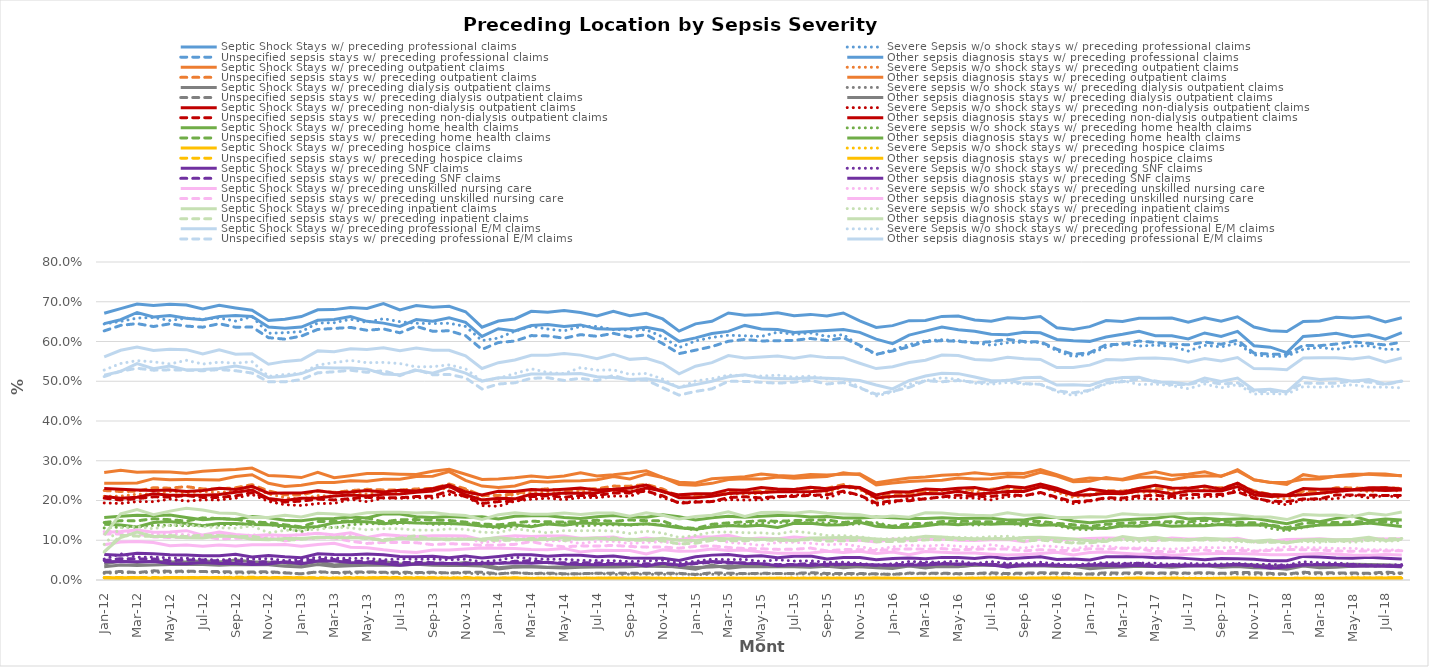
| Category | Septic Shock Stays w/ preceding professional claims | Severe Sepsis w/o shock stays w/ preceding professional claims | Unspecified sepsis stays w/ preceding professional claims | Other sepsis diagnosis stays w/ preceding professional claims | Septic Shock Stays w/ preceding outpatient claims | Severe Sepsis w/o shock stays w/ preceding outpatient claims | Unspecified sepsis stays w/ preceding outpatient claims | Other sepsis diagnosis stays w/ preceding outpatient claims | Septic Shock Stays w/ preceding dialysis outpatient claims | Severe sepsis w/o shock stays w/ preceding dialysis outpatient claims | Unspecified sepsis stays w/ preceding dialysis outpatient claims | Other sepsis diagnosis stays w/ preceding dialysis outpatient claims | Septic Shock Stays w/ preceding non-dialysis outpatient claims | Severe Sepsis w/o shock stays w/ preceding non-dialysis outpatient claims | Unspecified sepsis stays w/ preceding non-dialysis outpatient claims | Other sepsis diagnosis stays w/ preceding non-dialysis outpatient claims | Septic Shock Stays w/ preceding home health claims | Severe sepsis w/o shock stays w/ preceding home health claims | Unspecified sepsis stays w/ preceding home health claims | Other sepsis diagnosis stays w/ preceding home health claims | Septic Shock Stays w/ preceding hospice claims | Severe Sepsis w/o shock stays w/ preceding hospice claims | Unspecified sepsis stays w/ preceding hospice claims | Other sepsis diagnosis stays w/ preceding hospice claims | Septic Shock Stays w/ preceding SNF claims | Severe Sepsis w/o shock stays w/ preceding SNF claims | Unspecified sepsis stays w/ preceding SNF claims | Other sepsis diagnosis stays w/ preceding SNF claims | Septic Shock Stays w/ preceding unskilled nursing care | Severe sepsis w/o shock stays w/ preceding unskilled nursing care | Unspecified sepsis stays w/ preceding unskilled nursing care | Other sepsis diagnosis stays w/ preceding unskilled nursing care | Septic Shock Stays w/ preceding inpatient claims | Severe sepsis w/o shock stays w/ preceding inpatient claims | Unspecified sepsis stays w/ preceding inpatient claims | Other sepsis diagnosis stays w/ preceding inpatient claims | Septic Shock Stays w/ preceding professional E/M claims | Severe Sepsis w/o shock stays w/ preceding professional E/M claims | Unspecified sepsis stays w/ preceding professional E/M claims | Other sepsis diagnosis stays w/ preceding professional E/M claims |
|---|---|---|---|---|---|---|---|---|---|---|---|---|---|---|---|---|---|---|---|---|---|---|---|---|---|---|---|---|---|---|---|---|---|---|---|---|---|---|---|---|
| 2012-01-01 | 0.671 | 0.644 | 0.627 | 0.645 | 0.243 | 0.211 | 0.225 | 0.271 | 0.033 | 0.017 | 0.019 | 0.04 | 0.21 | 0.194 | 0.206 | 0.23 | 0.14 | 0.131 | 0.145 | 0.157 | 0.005 | 0.005 | 0.006 | 0.006 | 0.064 | 0.053 | 0.049 | 0.046 | 0.12 | 0.122 | 0.116 | 0.089 | 0.113 | 0.09 | 0.07 | 0.071 | 0.561 | 0.528 | 0.512 | 0.515 |
| 2012-02-01 | 0.683 | 0.651 | 0.641 | 0.655 | 0.243 | 0.211 | 0.223 | 0.276 | 0.037 | 0.018 | 0.021 | 0.048 | 0.206 | 0.193 | 0.201 | 0.229 | 0.138 | 0.133 | 0.149 | 0.16 | 0.006 | 0.005 | 0.006 | 0.004 | 0.062 | 0.066 | 0.054 | 0.047 | 0.122 | 0.123 | 0.116 | 0.096 | 0.166 | 0.132 | 0.112 | 0.107 | 0.578 | 0.545 | 0.525 | 0.525 |
| 2012-03-01 | 0.694 | 0.659 | 0.645 | 0.673 | 0.244 | 0.216 | 0.223 | 0.271 | 0.036 | 0.018 | 0.019 | 0.044 | 0.208 | 0.197 | 0.205 | 0.227 | 0.133 | 0.133 | 0.149 | 0.163 | 0.005 | 0.006 | 0.006 | 0.006 | 0.067 | 0.057 | 0.053 | 0.046 | 0.126 | 0.12 | 0.116 | 0.097 | 0.177 | 0.135 | 0.11 | 0.121 | 0.586 | 0.552 | 0.533 | 0.544 |
| 2012-04-01 | 0.69 | 0.66 | 0.638 | 0.662 | 0.255 | 0.216 | 0.232 | 0.273 | 0.038 | 0.019 | 0.023 | 0.047 | 0.217 | 0.197 | 0.209 | 0.225 | 0.145 | 0.138 | 0.154 | 0.162 | 0.004 | 0.004 | 0.006 | 0.005 | 0.066 | 0.058 | 0.053 | 0.047 | 0.12 | 0.114 | 0.108 | 0.094 | 0.164 | 0.129 | 0.11 | 0.11 | 0.577 | 0.549 | 0.528 | 0.531 |
| 2012-05-01 | 0.694 | 0.653 | 0.644 | 0.665 | 0.252 | 0.223 | 0.231 | 0.272 | 0.039 | 0.019 | 0.022 | 0.045 | 0.213 | 0.204 | 0.209 | 0.226 | 0.147 | 0.137 | 0.152 | 0.164 | 0.006 | 0.006 | 0.005 | 0.005 | 0.064 | 0.056 | 0.049 | 0.042 | 0.121 | 0.116 | 0.107 | 0.086 | 0.173 | 0.138 | 0.112 | 0.109 | 0.58 | 0.544 | 0.529 | 0.539 |
| 2012-06-01 | 0.692 | 0.659 | 0.639 | 0.658 | 0.253 | 0.219 | 0.235 | 0.269 | 0.04 | 0.021 | 0.022 | 0.046 | 0.213 | 0.198 | 0.213 | 0.223 | 0.142 | 0.136 | 0.148 | 0.157 | 0.006 | 0.005 | 0.006 | 0.005 | 0.063 | 0.055 | 0.05 | 0.041 | 0.124 | 0.114 | 0.107 | 0.088 | 0.181 | 0.139 | 0.109 | 0.106 | 0.58 | 0.553 | 0.528 | 0.529 |
| 2012-07-01 | 0.682 | 0.656 | 0.636 | 0.655 | 0.253 | 0.223 | 0.229 | 0.274 | 0.039 | 0.021 | 0.021 | 0.048 | 0.213 | 0.202 | 0.208 | 0.225 | 0.136 | 0.138 | 0.156 | 0.152 | 0.005 | 0.006 | 0.006 | 0.006 | 0.061 | 0.052 | 0.05 | 0.044 | 0.113 | 0.112 | 0.11 | 0.085 | 0.176 | 0.134 | 0.113 | 0.106 | 0.569 | 0.543 | 0.526 | 0.53 |
| 2012-08-01 | 0.691 | 0.659 | 0.645 | 0.663 | 0.252 | 0.22 | 0.229 | 0.276 | 0.037 | 0.019 | 0.021 | 0.046 | 0.215 | 0.201 | 0.208 | 0.231 | 0.142 | 0.138 | 0.154 | 0.155 | 0.006 | 0.007 | 0.006 | 0.005 | 0.061 | 0.05 | 0.048 | 0.041 | 0.12 | 0.114 | 0.103 | 0.088 | 0.169 | 0.131 | 0.112 | 0.111 | 0.579 | 0.548 | 0.529 | 0.532 |
| 2012-09-01 | 0.684 | 0.651 | 0.636 | 0.665 | 0.26 | 0.223 | 0.232 | 0.278 | 0.039 | 0.017 | 0.02 | 0.05 | 0.221 | 0.206 | 0.212 | 0.228 | 0.142 | 0.14 | 0.153 | 0.152 | 0.004 | 0.007 | 0.007 | 0.005 | 0.065 | 0.053 | 0.048 | 0.041 | 0.115 | 0.108 | 0.105 | 0.085 | 0.167 | 0.13 | 0.109 | 0.11 | 0.568 | 0.545 | 0.527 | 0.539 |
| 2012-10-01 | 0.678 | 0.663 | 0.636 | 0.663 | 0.265 | 0.233 | 0.24 | 0.282 | 0.038 | 0.018 | 0.02 | 0.046 | 0.226 | 0.215 | 0.22 | 0.236 | 0.14 | 0.142 | 0.146 | 0.16 | 0.005 | 0.005 | 0.007 | 0.004 | 0.058 | 0.053 | 0.045 | 0.039 | 0.111 | 0.114 | 0.104 | 0.089 | 0.157 | 0.136 | 0.11 | 0.102 | 0.569 | 0.549 | 0.521 | 0.531 |
| 2012-11-01 | 0.653 | 0.621 | 0.61 | 0.636 | 0.243 | 0.216 | 0.224 | 0.263 | 0.038 | 0.019 | 0.021 | 0.044 | 0.205 | 0.198 | 0.203 | 0.218 | 0.139 | 0.141 | 0.144 | 0.157 | 0.005 | 0.005 | 0.006 | 0.005 | 0.062 | 0.054 | 0.046 | 0.04 | 0.114 | 0.108 | 0.106 | 0.088 | 0.157 | 0.119 | 0.103 | 0.102 | 0.543 | 0.512 | 0.499 | 0.51 |
| 2012-12-01 | 0.656 | 0.622 | 0.606 | 0.633 | 0.235 | 0.207 | 0.214 | 0.261 | 0.035 | 0.018 | 0.018 | 0.042 | 0.2 | 0.189 | 0.196 | 0.219 | 0.136 | 0.13 | 0.139 | 0.15 | 0.005 | 0.006 | 0.006 | 0.006 | 0.058 | 0.049 | 0.044 | 0.046 | 0.112 | 0.107 | 0.099 | 0.089 | 0.163 | 0.125 | 0.1 | 0.104 | 0.55 | 0.517 | 0.499 | 0.513 |
| 2013-01-01 | 0.663 | 0.625 | 0.614 | 0.636 | 0.239 | 0.203 | 0.214 | 0.258 | 0.033 | 0.016 | 0.015 | 0.039 | 0.206 | 0.187 | 0.198 | 0.219 | 0.132 | 0.121 | 0.134 | 0.149 | 0.006 | 0.005 | 0.005 | 0.004 | 0.056 | 0.052 | 0.047 | 0.041 | 0.114 | 0.116 | 0.104 | 0.085 | 0.158 | 0.126 | 0.102 | 0.105 | 0.553 | 0.52 | 0.504 | 0.519 |
| 2013-02-01 | 0.68 | 0.646 | 0.63 | 0.653 | 0.245 | 0.212 | 0.224 | 0.271 | 0.039 | 0.02 | 0.021 | 0.047 | 0.206 | 0.192 | 0.203 | 0.224 | 0.135 | 0.136 | 0.147 | 0.154 | 0.005 | 0.005 | 0.006 | 0.004 | 0.066 | 0.057 | 0.052 | 0.048 | 0.118 | 0.117 | 0.106 | 0.089 | 0.168 | 0.127 | 0.106 | 0.107 | 0.576 | 0.541 | 0.521 | 0.535 |
| 2013-03-01 | 0.68 | 0.647 | 0.633 | 0.655 | 0.245 | 0.211 | 0.22 | 0.257 | 0.034 | 0.018 | 0.019 | 0.038 | 0.211 | 0.193 | 0.201 | 0.219 | 0.144 | 0.131 | 0.147 | 0.155 | 0.004 | 0.005 | 0.005 | 0.004 | 0.064 | 0.055 | 0.051 | 0.048 | 0.113 | 0.113 | 0.106 | 0.092 | 0.166 | 0.133 | 0.108 | 0.106 | 0.574 | 0.547 | 0.524 | 0.533 |
| 2013-04-01 | 0.685 | 0.656 | 0.635 | 0.663 | 0.249 | 0.219 | 0.225 | 0.262 | 0.036 | 0.016 | 0.02 | 0.041 | 0.214 | 0.203 | 0.205 | 0.221 | 0.147 | 0.139 | 0.149 | 0.158 | 0.005 | 0.005 | 0.006 | 0.004 | 0.064 | 0.054 | 0.048 | 0.044 | 0.119 | 0.112 | 0.098 | 0.083 | 0.163 | 0.131 | 0.108 | 0.107 | 0.582 | 0.552 | 0.528 | 0.534 |
| 2013-05-01 | 0.683 | 0.648 | 0.628 | 0.651 | 0.248 | 0.216 | 0.228 | 0.268 | 0.037 | 0.02 | 0.02 | 0.043 | 0.212 | 0.197 | 0.208 | 0.225 | 0.146 | 0.142 | 0.156 | 0.156 | 0.005 | 0.005 | 0.005 | 0.004 | 0.065 | 0.055 | 0.046 | 0.043 | 0.107 | 0.106 | 0.092 | 0.081 | 0.169 | 0.126 | 0.104 | 0.106 | 0.58 | 0.547 | 0.522 | 0.531 |
| 2013-06-01 | 0.696 | 0.657 | 0.632 | 0.646 | 0.253 | 0.224 | 0.226 | 0.268 | 0.038 | 0.018 | 0.02 | 0.046 | 0.216 | 0.206 | 0.207 | 0.221 | 0.142 | 0.141 | 0.146 | 0.167 | 0.005 | 0.005 | 0.006 | 0.005 | 0.063 | 0.051 | 0.047 | 0.041 | 0.114 | 0.101 | 0.095 | 0.076 | 0.171 | 0.129 | 0.101 | 0.099 | 0.584 | 0.547 | 0.526 | 0.519 |
| 2013-07-01 | 0.679 | 0.65 | 0.622 | 0.638 | 0.253 | 0.221 | 0.226 | 0.266 | 0.037 | 0.016 | 0.019 | 0.04 | 0.217 | 0.205 | 0.207 | 0.226 | 0.145 | 0.142 | 0.152 | 0.166 | 0.004 | 0.006 | 0.006 | 0.004 | 0.059 | 0.053 | 0.044 | 0.037 | 0.111 | 0.105 | 0.095 | 0.072 | 0.17 | 0.129 | 0.105 | 0.105 | 0.577 | 0.545 | 0.514 | 0.516 |
| 2013-08-01 | 0.69 | 0.646 | 0.638 | 0.655 | 0.26 | 0.225 | 0.229 | 0.265 | 0.039 | 0.017 | 0.019 | 0.041 | 0.221 | 0.207 | 0.21 | 0.224 | 0.144 | 0.146 | 0.152 | 0.159 | 0.004 | 0.006 | 0.006 | 0.005 | 0.059 | 0.052 | 0.044 | 0.04 | 0.11 | 0.104 | 0.094 | 0.069 | 0.169 | 0.126 | 0.112 | 0.103 | 0.583 | 0.536 | 0.53 | 0.527 |
| 2013-09-01 | 0.686 | 0.645 | 0.626 | 0.651 | 0.261 | 0.223 | 0.23 | 0.273 | 0.037 | 0.017 | 0.019 | 0.043 | 0.224 | 0.206 | 0.211 | 0.231 | 0.143 | 0.14 | 0.151 | 0.157 | 0.005 | 0.005 | 0.006 | 0.004 | 0.06 | 0.053 | 0.044 | 0.041 | 0.111 | 0.102 | 0.089 | 0.076 | 0.17 | 0.125 | 0.103 | 0.103 | 0.578 | 0.537 | 0.516 | 0.52 |
| 2013-10-01 | 0.688 | 0.646 | 0.627 | 0.659 | 0.273 | 0.233 | 0.241 | 0.279 | 0.037 | 0.018 | 0.018 | 0.04 | 0.236 | 0.215 | 0.224 | 0.239 | 0.142 | 0.141 | 0.15 | 0.159 | 0.004 | 0.006 | 0.005 | 0.004 | 0.056 | 0.051 | 0.042 | 0.042 | 0.111 | 0.104 | 0.091 | 0.076 | 0.164 | 0.129 | 0.101 | 0.103 | 0.578 | 0.541 | 0.517 | 0.533 |
| 2013-11-01 | 0.675 | 0.638 | 0.615 | 0.648 | 0.251 | 0.228 | 0.229 | 0.266 | 0.036 | 0.017 | 0.02 | 0.044 | 0.214 | 0.211 | 0.21 | 0.222 | 0.14 | 0.143 | 0.146 | 0.158 | 0.004 | 0.005 | 0.006 | 0.003 | 0.06 | 0.052 | 0.042 | 0.04 | 0.111 | 0.106 | 0.09 | 0.078 | 0.162 | 0.128 | 0.104 | 0.102 | 0.564 | 0.531 | 0.509 | 0.521 |
| 2013-12-01 | 0.636 | 0.602 | 0.58 | 0.613 | 0.236 | 0.202 | 0.212 | 0.253 | 0.035 | 0.015 | 0.02 | 0.039 | 0.201 | 0.187 | 0.192 | 0.214 | 0.136 | 0.135 | 0.141 | 0.159 | 0.005 | 0.004 | 0.005 | 0.003 | 0.055 | 0.045 | 0.04 | 0.042 | 0.101 | 0.094 | 0.087 | 0.08 | 0.153 | 0.12 | 0.1 | 0.103 | 0.532 | 0.501 | 0.48 | 0.5 |
| 2014-01-01 | 0.651 | 0.609 | 0.597 | 0.632 | 0.233 | 0.201 | 0.213 | 0.254 | 0.027 | 0.015 | 0.016 | 0.031 | 0.206 | 0.185 | 0.197 | 0.223 | 0.133 | 0.131 | 0.139 | 0.154 | 0.004 | 0.004 | 0.005 | 0.003 | 0.059 | 0.05 | 0.042 | 0.042 | 0.107 | 0.097 | 0.088 | 0.08 | 0.164 | 0.119 | 0.1 | 0.106 | 0.547 | 0.507 | 0.493 | 0.509 |
| 2014-02-01 | 0.657 | 0.626 | 0.601 | 0.626 | 0.237 | 0.216 | 0.217 | 0.257 | 0.032 | 0.018 | 0.019 | 0.035 | 0.204 | 0.198 | 0.198 | 0.223 | 0.139 | 0.134 | 0.143 | 0.16 | 0.005 | 0.005 | 0.005 | 0.005 | 0.063 | 0.058 | 0.047 | 0.044 | 0.111 | 0.104 | 0.09 | 0.079 | 0.169 | 0.129 | 0.1 | 0.102 | 0.554 | 0.519 | 0.496 | 0.509 |
| 2014-03-01 | 0.676 | 0.638 | 0.615 | 0.64 | 0.248 | 0.219 | 0.226 | 0.262 | 0.033 | 0.016 | 0.016 | 0.034 | 0.215 | 0.203 | 0.21 | 0.228 | 0.134 | 0.137 | 0.148 | 0.162 | 0.004 | 0.005 | 0.004 | 0.003 | 0.064 | 0.053 | 0.049 | 0.042 | 0.109 | 0.108 | 0.097 | 0.077 | 0.165 | 0.124 | 0.104 | 0.101 | 0.565 | 0.531 | 0.507 | 0.518 |
| 2014-04-01 | 0.673 | 0.631 | 0.614 | 0.643 | 0.247 | 0.221 | 0.229 | 0.258 | 0.032 | 0.016 | 0.017 | 0.032 | 0.215 | 0.206 | 0.212 | 0.226 | 0.141 | 0.14 | 0.146 | 0.162 | 0.004 | 0.004 | 0.004 | 0.003 | 0.06 | 0.052 | 0.044 | 0.045 | 0.111 | 0.098 | 0.088 | 0.076 | 0.166 | 0.119 | 0.105 | 0.102 | 0.565 | 0.522 | 0.509 | 0.518 |
| 2014-05-01 | 0.678 | 0.627 | 0.608 | 0.638 | 0.249 | 0.217 | 0.224 | 0.262 | 0.03 | 0.015 | 0.016 | 0.033 | 0.219 | 0.202 | 0.208 | 0.229 | 0.138 | 0.144 | 0.146 | 0.157 | 0.004 | 0.004 | 0.004 | 0.003 | 0.062 | 0.052 | 0.043 | 0.04 | 0.111 | 0.099 | 0.083 | 0.08 | 0.169 | 0.124 | 0.099 | 0.106 | 0.57 | 0.519 | 0.502 | 0.518 |
| 2014-06-01 | 0.673 | 0.638 | 0.617 | 0.642 | 0.25 | 0.223 | 0.228 | 0.27 | 0.032 | 0.016 | 0.016 | 0.039 | 0.218 | 0.207 | 0.213 | 0.231 | 0.144 | 0.136 | 0.147 | 0.155 | 0.004 | 0.004 | 0.005 | 0.004 | 0.062 | 0.049 | 0.043 | 0.039 | 0.105 | 0.092 | 0.086 | 0.071 | 0.165 | 0.124 | 0.104 | 0.103 | 0.566 | 0.534 | 0.507 | 0.52 |
| 2014-07-01 | 0.664 | 0.638 | 0.613 | 0.632 | 0.252 | 0.224 | 0.23 | 0.262 | 0.032 | 0.017 | 0.017 | 0.035 | 0.22 | 0.207 | 0.213 | 0.227 | 0.142 | 0.138 | 0.15 | 0.159 | 0.005 | 0.004 | 0.004 | 0.004 | 0.058 | 0.049 | 0.043 | 0.039 | 0.106 | 0.097 | 0.085 | 0.075 | 0.168 | 0.125 | 0.104 | 0.106 | 0.557 | 0.528 | 0.502 | 0.511 |
| 2014-08-01 | 0.676 | 0.63 | 0.621 | 0.631 | 0.26 | 0.225 | 0.236 | 0.265 | 0.033 | 0.014 | 0.017 | 0.037 | 0.227 | 0.211 | 0.219 | 0.228 | 0.142 | 0.139 | 0.148 | 0.163 | 0.005 | 0.004 | 0.004 | 0.003 | 0.06 | 0.048 | 0.042 | 0.04 | 0.108 | 0.097 | 0.087 | 0.074 | 0.169 | 0.123 | 0.106 | 0.102 | 0.568 | 0.529 | 0.515 | 0.51 |
| 2014-09-01 | 0.665 | 0.629 | 0.611 | 0.632 | 0.254 | 0.225 | 0.236 | 0.269 | 0.033 | 0.015 | 0.017 | 0.038 | 0.221 | 0.211 | 0.219 | 0.232 | 0.139 | 0.138 | 0.151 | 0.159 | 0.005 | 0.005 | 0.005 | 0.003 | 0.056 | 0.046 | 0.04 | 0.04 | 0.1 | 0.092 | 0.084 | 0.074 | 0.16 | 0.117 | 0.1 | 0.102 | 0.555 | 0.517 | 0.503 | 0.504 |
| 2014-10-01 | 0.671 | 0.63 | 0.617 | 0.636 | 0.267 | 0.24 | 0.241 | 0.275 | 0.035 | 0.015 | 0.017 | 0.036 | 0.231 | 0.226 | 0.224 | 0.239 | 0.142 | 0.141 | 0.149 | 0.158 | 0.005 | 0.004 | 0.004 | 0.003 | 0.055 | 0.048 | 0.041 | 0.036 | 0.106 | 0.095 | 0.083 | 0.065 | 0.169 | 0.123 | 0.1 | 0.101 | 0.558 | 0.52 | 0.503 | 0.506 |
| 2014-11-01 | 0.657 | 0.611 | 0.595 | 0.628 | 0.258 | 0.221 | 0.229 | 0.258 | 0.034 | 0.014 | 0.017 | 0.036 | 0.224 | 0.207 | 0.212 | 0.222 | 0.137 | 0.139 | 0.149 | 0.164 | 0.004 | 0.005 | 0.005 | 0.004 | 0.055 | 0.05 | 0.041 | 0.042 | 0.101 | 0.096 | 0.083 | 0.076 | 0.163 | 0.118 | 0.099 | 0.105 | 0.545 | 0.506 | 0.484 | 0.5 |
| 2014-12-01 | 0.626 | 0.585 | 0.57 | 0.6 | 0.24 | 0.21 | 0.21 | 0.246 | 0.033 | 0.015 | 0.017 | 0.032 | 0.207 | 0.195 | 0.193 | 0.214 | 0.132 | 0.133 | 0.133 | 0.159 | 0.004 | 0.005 | 0.004 | 0.003 | 0.049 | 0.043 | 0.036 | 0.038 | 0.101 | 0.091 | 0.08 | 0.072 | 0.153 | 0.107 | 0.091 | 0.1 | 0.519 | 0.483 | 0.465 | 0.484 |
| 2015-01-01 | 0.644 | 0.602 | 0.578 | 0.609 | 0.238 | 0.211 | 0.21 | 0.244 | 0.031 | 0.013 | 0.014 | 0.027 | 0.207 | 0.197 | 0.196 | 0.217 | 0.128 | 0.126 | 0.129 | 0.151 | 0.003 | 0.005 | 0.004 | 0.003 | 0.058 | 0.047 | 0.041 | 0.043 | 0.109 | 0.099 | 0.085 | 0.073 | 0.16 | 0.112 | 0.092 | 0.099 | 0.538 | 0.501 | 0.474 | 0.492 |
| 2015-02-01 | 0.651 | 0.61 | 0.587 | 0.62 | 0.243 | 0.212 | 0.215 | 0.255 | 0.032 | 0.015 | 0.018 | 0.038 | 0.211 | 0.198 | 0.197 | 0.217 | 0.133 | 0.135 | 0.14 | 0.156 | 0.004 | 0.003 | 0.004 | 0.003 | 0.063 | 0.052 | 0.045 | 0.046 | 0.108 | 0.104 | 0.086 | 0.078 | 0.163 | 0.12 | 0.1 | 0.105 | 0.547 | 0.506 | 0.481 | 0.5 |
| 2015-03-01 | 0.672 | 0.616 | 0.601 | 0.626 | 0.253 | 0.216 | 0.224 | 0.257 | 0.035 | 0.013 | 0.017 | 0.03 | 0.218 | 0.202 | 0.207 | 0.227 | 0.137 | 0.136 | 0.144 | 0.16 | 0.004 | 0.004 | 0.004 | 0.003 | 0.064 | 0.051 | 0.043 | 0.045 | 0.112 | 0.095 | 0.082 | 0.074 | 0.172 | 0.121 | 0.099 | 0.104 | 0.565 | 0.515 | 0.5 | 0.511 |
| 2015-04-01 | 0.666 | 0.614 | 0.605 | 0.64 | 0.255 | 0.217 | 0.226 | 0.26 | 0.035 | 0.016 | 0.016 | 0.034 | 0.219 | 0.201 | 0.21 | 0.226 | 0.135 | 0.14 | 0.146 | 0.158 | 0.004 | 0.004 | 0.004 | 0.003 | 0.059 | 0.052 | 0.044 | 0.042 | 0.103 | 0.091 | 0.079 | 0.076 | 0.16 | 0.119 | 0.099 | 0.104 | 0.559 | 0.515 | 0.5 | 0.516 |
| 2015-05-01 | 0.668 | 0.613 | 0.601 | 0.631 | 0.254 | 0.217 | 0.223 | 0.266 | 0.034 | 0.015 | 0.017 | 0.034 | 0.22 | 0.202 | 0.206 | 0.233 | 0.138 | 0.143 | 0.149 | 0.16 | 0.005 | 0.004 | 0.004 | 0.004 | 0.061 | 0.046 | 0.041 | 0.041 | 0.106 | 0.087 | 0.079 | 0.071 | 0.17 | 0.118 | 0.102 | 0.102 | 0.561 | 0.513 | 0.497 | 0.509 |
| 2015-06-01 | 0.672 | 0.623 | 0.602 | 0.63 | 0.259 | 0.225 | 0.227 | 0.263 | 0.037 | 0.016 | 0.016 | 0.034 | 0.222 | 0.208 | 0.21 | 0.229 | 0.132 | 0.145 | 0.148 | 0.162 | 0.004 | 0.004 | 0.004 | 0.003 | 0.056 | 0.051 | 0.039 | 0.036 | 0.104 | 0.095 | 0.077 | 0.067 | 0.17 | 0.116 | 0.099 | 0.104 | 0.563 | 0.515 | 0.495 | 0.507 |
| 2015-07-01 | 0.665 | 0.618 | 0.603 | 0.623 | 0.256 | 0.229 | 0.227 | 0.261 | 0.034 | 0.015 | 0.016 | 0.033 | 0.222 | 0.214 | 0.21 | 0.228 | 0.142 | 0.143 | 0.149 | 0.162 | 0.004 | 0.006 | 0.004 | 0.004 | 0.06 | 0.048 | 0.039 | 0.039 | 0.108 | 0.095 | 0.077 | 0.067 | 0.168 | 0.123 | 0.1 | 0.098 | 0.558 | 0.51 | 0.498 | 0.506 |
| 2015-08-01 | 0.668 | 0.622 | 0.608 | 0.625 | 0.258 | 0.231 | 0.232 | 0.266 | 0.036 | 0.015 | 0.019 | 0.032 | 0.222 | 0.216 | 0.213 | 0.233 | 0.143 | 0.145 | 0.151 | 0.159 | 0.005 | 0.005 | 0.004 | 0.003 | 0.06 | 0.048 | 0.042 | 0.036 | 0.105 | 0.092 | 0.08 | 0.068 | 0.173 | 0.118 | 0.102 | 0.106 | 0.564 | 0.513 | 0.502 | 0.509 |
| 2015-09-01 | 0.664 | 0.613 | 0.603 | 0.628 | 0.26 | 0.22 | 0.231 | 0.264 | 0.035 | 0.014 | 0.016 | 0.034 | 0.225 | 0.206 | 0.214 | 0.23 | 0.138 | 0.144 | 0.151 | 0.16 | 0.004 | 0.005 | 0.004 | 0.003 | 0.053 | 0.044 | 0.037 | 0.039 | 0.103 | 0.089 | 0.073 | 0.072 | 0.168 | 0.112 | 0.098 | 0.107 | 0.559 | 0.506 | 0.493 | 0.508 |
| 2015-10-01 | 0.672 | 0.617 | 0.609 | 0.63 | 0.27 | 0.235 | 0.24 | 0.266 | 0.035 | 0.014 | 0.017 | 0.031 | 0.235 | 0.221 | 0.223 | 0.235 | 0.139 | 0.139 | 0.144 | 0.156 | 0.004 | 0.005 | 0.004 | 0.003 | 0.057 | 0.045 | 0.039 | 0.039 | 0.1 | 0.091 | 0.077 | 0.069 | 0.166 | 0.111 | 0.099 | 0.107 | 0.559 | 0.506 | 0.497 | 0.506 |
| 2015-11-01 | 0.652 | 0.588 | 0.591 | 0.623 | 0.265 | 0.228 | 0.23 | 0.267 | 0.033 | 0.014 | 0.016 | 0.034 | 0.231 | 0.213 | 0.213 | 0.233 | 0.145 | 0.141 | 0.149 | 0.156 | 0.004 | 0.004 | 0.004 | 0.003 | 0.056 | 0.042 | 0.039 | 0.039 | 0.1 | 0.084 | 0.076 | 0.072 | 0.164 | 0.109 | 0.1 | 0.106 | 0.545 | 0.485 | 0.483 | 0.502 |
| 2015-12-01 | 0.635 | 0.567 | 0.568 | 0.606 | 0.239 | 0.203 | 0.209 | 0.244 | 0.033 | 0.015 | 0.015 | 0.031 | 0.206 | 0.188 | 0.194 | 0.214 | 0.135 | 0.145 | 0.14 | 0.158 | 0.005 | 0.004 | 0.004 | 0.003 | 0.051 | 0.038 | 0.037 | 0.038 | 0.096 | 0.077 | 0.074 | 0.067 | 0.157 | 0.103 | 0.096 | 0.103 | 0.532 | 0.463 | 0.467 | 0.491 |
| 2016-01-01 | 0.64 | 0.579 | 0.576 | 0.595 | 0.244 | 0.209 | 0.214 | 0.251 | 0.034 | 0.014 | 0.014 | 0.029 | 0.21 | 0.195 | 0.2 | 0.222 | 0.132 | 0.135 | 0.135 | 0.157 | 0.004 | 0.005 | 0.005 | 0.002 | 0.054 | 0.041 | 0.038 | 0.037 | 0.103 | 0.083 | 0.077 | 0.07 | 0.161 | 0.104 | 0.097 | 0.101 | 0.537 | 0.473 | 0.475 | 0.481 |
| 2016-02-01 | 0.652 | 0.592 | 0.587 | 0.616 | 0.248 | 0.222 | 0.216 | 0.257 | 0.037 | 0.016 | 0.017 | 0.035 | 0.211 | 0.206 | 0.199 | 0.222 | 0.133 | 0.137 | 0.142 | 0.155 | 0.004 | 0.003 | 0.004 | 0.003 | 0.055 | 0.046 | 0.04 | 0.038 | 0.1 | 0.088 | 0.078 | 0.064 | 0.158 | 0.107 | 0.098 | 0.105 | 0.547 | 0.493 | 0.485 | 0.502 |
| 2016-03-01 | 0.653 | 0.602 | 0.6 | 0.626 | 0.249 | 0.219 | 0.222 | 0.259 | 0.032 | 0.016 | 0.017 | 0.03 | 0.217 | 0.204 | 0.205 | 0.229 | 0.136 | 0.139 | 0.142 | 0.155 | 0.004 | 0.004 | 0.003 | 0.003 | 0.054 | 0.045 | 0.042 | 0.038 | 0.102 | 0.085 | 0.077 | 0.072 | 0.169 | 0.108 | 0.101 | 0.11 | 0.553 | 0.501 | 0.502 | 0.513 |
| 2016-04-01 | 0.663 | 0.605 | 0.602 | 0.637 | 0.251 | 0.225 | 0.226 | 0.264 | 0.034 | 0.016 | 0.017 | 0.037 | 0.217 | 0.209 | 0.209 | 0.227 | 0.141 | 0.141 | 0.147 | 0.157 | 0.005 | 0.004 | 0.004 | 0.003 | 0.057 | 0.045 | 0.042 | 0.04 | 0.103 | 0.088 | 0.079 | 0.07 | 0.169 | 0.108 | 0.101 | 0.108 | 0.566 | 0.509 | 0.499 | 0.52 |
| 2016-05-01 | 0.664 | 0.602 | 0.6 | 0.63 | 0.257 | 0.222 | 0.23 | 0.265 | 0.033 | 0.015 | 0.016 | 0.034 | 0.223 | 0.207 | 0.214 | 0.231 | 0.139 | 0.144 | 0.148 | 0.155 | 0.004 | 0.004 | 0.004 | 0.003 | 0.056 | 0.048 | 0.039 | 0.04 | 0.1 | 0.085 | 0.076 | 0.068 | 0.165 | 0.108 | 0.102 | 0.105 | 0.565 | 0.505 | 0.502 | 0.519 |
| 2016-06-01 | 0.654 | 0.597 | 0.597 | 0.626 | 0.254 | 0.222 | 0.227 | 0.27 | 0.038 | 0.016 | 0.017 | 0.037 | 0.216 | 0.206 | 0.21 | 0.233 | 0.142 | 0.138 | 0.147 | 0.155 | 0.005 | 0.005 | 0.004 | 0.003 | 0.054 | 0.041 | 0.039 | 0.04 | 0.1 | 0.082 | 0.078 | 0.068 | 0.163 | 0.106 | 0.101 | 0.104 | 0.555 | 0.495 | 0.497 | 0.511 |
| 2016-07-01 | 0.651 | 0.59 | 0.599 | 0.619 | 0.255 | 0.217 | 0.228 | 0.265 | 0.036 | 0.015 | 0.018 | 0.04 | 0.219 | 0.202 | 0.21 | 0.225 | 0.14 | 0.142 | 0.146 | 0.155 | 0.005 | 0.005 | 0.004 | 0.003 | 0.059 | 0.046 | 0.039 | 0.038 | 0.101 | 0.089 | 0.078 | 0.065 | 0.161 | 0.109 | 0.104 | 0.104 | 0.553 | 0.493 | 0.498 | 0.501 |
| 2016-08-01 | 0.659 | 0.597 | 0.605 | 0.617 | 0.26 | 0.224 | 0.231 | 0.269 | 0.037 | 0.014 | 0.016 | 0.033 | 0.223 | 0.21 | 0.215 | 0.236 | 0.142 | 0.145 | 0.147 | 0.151 | 0.005 | 0.004 | 0.005 | 0.002 | 0.053 | 0.042 | 0.038 | 0.033 | 0.102 | 0.083 | 0.078 | 0.063 | 0.169 | 0.11 | 0.105 | 0.103 | 0.56 | 0.497 | 0.503 | 0.502 |
| 2016-09-01 | 0.658 | 0.598 | 0.6 | 0.623 | 0.258 | 0.227 | 0.229 | 0.268 | 0.036 | 0.015 | 0.017 | 0.036 | 0.223 | 0.212 | 0.212 | 0.232 | 0.142 | 0.136 | 0.147 | 0.151 | 0.004 | 0.004 | 0.004 | 0.002 | 0.056 | 0.041 | 0.038 | 0.038 | 0.096 | 0.08 | 0.073 | 0.064 | 0.163 | 0.105 | 0.098 | 0.107 | 0.557 | 0.493 | 0.494 | 0.509 |
| 2016-10-01 | 0.663 | 0.597 | 0.599 | 0.622 | 0.271 | 0.236 | 0.238 | 0.278 | 0.036 | 0.016 | 0.018 | 0.037 | 0.235 | 0.22 | 0.22 | 0.241 | 0.138 | 0.143 | 0.147 | 0.158 | 0.005 | 0.004 | 0.004 | 0.003 | 0.058 | 0.044 | 0.039 | 0.037 | 0.104 | 0.086 | 0.076 | 0.067 | 0.164 | 0.107 | 0.101 | 0.107 | 0.555 | 0.493 | 0.492 | 0.51 |
| 2016-11-01 | 0.635 | 0.577 | 0.581 | 0.605 | 0.261 | 0.221 | 0.226 | 0.265 | 0.036 | 0.015 | 0.018 | 0.034 | 0.225 | 0.205 | 0.208 | 0.231 | 0.139 | 0.137 | 0.143 | 0.157 | 0.005 | 0.006 | 0.005 | 0.002 | 0.052 | 0.041 | 0.037 | 0.037 | 0.1 | 0.084 | 0.075 | 0.07 | 0.157 | 0.1 | 0.097 | 0.105 | 0.535 | 0.474 | 0.476 | 0.491 |
| 2016-12-01 | 0.63 | 0.562 | 0.568 | 0.602 | 0.247 | 0.208 | 0.213 | 0.251 | 0.034 | 0.016 | 0.016 | 0.035 | 0.214 | 0.192 | 0.197 | 0.216 | 0.131 | 0.128 | 0.139 | 0.148 | 0.004 | 0.005 | 0.004 | 0.003 | 0.053 | 0.037 | 0.036 | 0.035 | 0.102 | 0.078 | 0.074 | 0.063 | 0.157 | 0.094 | 0.093 | 0.103 | 0.535 | 0.464 | 0.471 | 0.491 |
| 2017-01-01 | 0.637 | 0.569 | 0.572 | 0.6 | 0.249 | 0.213 | 0.215 | 0.257 | 0.035 | 0.014 | 0.015 | 0.028 | 0.214 | 0.198 | 0.2 | 0.229 | 0.131 | 0.126 | 0.135 | 0.144 | 0.004 | 0.004 | 0.004 | 0.003 | 0.05 | 0.041 | 0.038 | 0.038 | 0.104 | 0.086 | 0.079 | 0.069 | 0.159 | 0.099 | 0.094 | 0.099 | 0.541 | 0.477 | 0.477 | 0.489 |
| 2017-02-01 | 0.653 | 0.586 | 0.592 | 0.611 | 0.258 | 0.219 | 0.225 | 0.255 | 0.04 | 0.014 | 0.018 | 0.032 | 0.218 | 0.206 | 0.207 | 0.223 | 0.13 | 0.134 | 0.14 | 0.148 | 0.004 | 0.004 | 0.003 | 0.003 | 0.059 | 0.044 | 0.04 | 0.037 | 0.106 | 0.085 | 0.077 | 0.07 | 0.158 | 0.103 | 0.098 | 0.097 | 0.555 | 0.493 | 0.496 | 0.503 |
| 2017-03-01 | 0.65 | 0.595 | 0.593 | 0.618 | 0.252 | 0.217 | 0.223 | 0.254 | 0.035 | 0.015 | 0.017 | 0.033 | 0.217 | 0.201 | 0.206 | 0.221 | 0.136 | 0.135 | 0.143 | 0.151 | 0.004 | 0.003 | 0.004 | 0.004 | 0.059 | 0.042 | 0.04 | 0.035 | 0.105 | 0.08 | 0.08 | 0.067 | 0.167 | 0.1 | 0.103 | 0.109 | 0.553 | 0.502 | 0.499 | 0.509 |
| 2017-04-01 | 0.659 | 0.588 | 0.601 | 0.626 | 0.258 | 0.222 | 0.23 | 0.265 | 0.034 | 0.016 | 0.018 | 0.034 | 0.224 | 0.206 | 0.212 | 0.23 | 0.135 | 0.138 | 0.145 | 0.154 | 0.005 | 0.004 | 0.004 | 0.002 | 0.059 | 0.043 | 0.042 | 0.037 | 0.104 | 0.081 | 0.078 | 0.065 | 0.164 | 0.097 | 0.101 | 0.104 | 0.558 | 0.492 | 0.505 | 0.51 |
| 2017-05-01 | 0.659 | 0.591 | 0.598 | 0.615 | 0.258 | 0.219 | 0.23 | 0.272 | 0.034 | 0.017 | 0.017 | 0.034 | 0.224 | 0.203 | 0.213 | 0.238 | 0.14 | 0.141 | 0.145 | 0.155 | 0.004 | 0.004 | 0.004 | 0.003 | 0.056 | 0.042 | 0.036 | 0.034 | 0.1 | 0.08 | 0.072 | 0.066 | 0.164 | 0.103 | 0.099 | 0.108 | 0.559 | 0.493 | 0.501 | 0.498 |
| 2017-06-01 | 0.659 | 0.588 | 0.594 | 0.614 | 0.253 | 0.222 | 0.228 | 0.264 | 0.036 | 0.015 | 0.018 | 0.032 | 0.216 | 0.207 | 0.21 | 0.232 | 0.135 | 0.144 | 0.147 | 0.161 | 0.005 | 0.005 | 0.005 | 0.002 | 0.057 | 0.039 | 0.038 | 0.037 | 0.105 | 0.077 | 0.071 | 0.062 | 0.166 | 0.102 | 0.101 | 0.101 | 0.556 | 0.489 | 0.491 | 0.498 |
| 2017-07-01 | 0.649 | 0.576 | 0.592 | 0.606 | 0.26 | 0.222 | 0.232 | 0.266 | 0.036 | 0.017 | 0.017 | 0.035 | 0.224 | 0.205 | 0.215 | 0.231 | 0.136 | 0.141 | 0.146 | 0.153 | 0.004 | 0.005 | 0.004 | 0.003 | 0.054 | 0.041 | 0.038 | 0.036 | 0.103 | 0.081 | 0.074 | 0.064 | 0.168 | 0.102 | 0.101 | 0.1 | 0.548 | 0.481 | 0.492 | 0.493 |
| 2017-08-01 | 0.66 | 0.59 | 0.599 | 0.622 | 0.262 | 0.227 | 0.233 | 0.272 | 0.037 | 0.016 | 0.019 | 0.036 | 0.224 | 0.21 | 0.215 | 0.236 | 0.137 | 0.14 | 0.15 | 0.155 | 0.004 | 0.005 | 0.004 | 0.003 | 0.051 | 0.041 | 0.037 | 0.036 | 0.104 | 0.082 | 0.075 | 0.066 | 0.166 | 0.101 | 0.1 | 0.105 | 0.557 | 0.493 | 0.5 | 0.508 |
| 2017-09-01 | 0.651 | 0.587 | 0.593 | 0.613 | 0.262 | 0.225 | 0.232 | 0.26 | 0.038 | 0.015 | 0.017 | 0.032 | 0.224 | 0.21 | 0.215 | 0.229 | 0.139 | 0.14 | 0.148 | 0.152 | 0.005 | 0.004 | 0.004 | 0.002 | 0.054 | 0.04 | 0.037 | 0.037 | 0.102 | 0.081 | 0.071 | 0.066 | 0.167 | 0.1 | 0.101 | 0.103 | 0.551 | 0.483 | 0.493 | 0.5 |
| 2017-10-01 | 0.662 | 0.595 | 0.603 | 0.625 | 0.275 | 0.244 | 0.241 | 0.278 | 0.04 | 0.015 | 0.019 | 0.034 | 0.235 | 0.229 | 0.222 | 0.244 | 0.138 | 0.138 | 0.144 | 0.154 | 0.005 | 0.004 | 0.004 | 0.003 | 0.054 | 0.042 | 0.04 | 0.038 | 0.105 | 0.082 | 0.075 | 0.067 | 0.163 | 0.097 | 0.1 | 0.102 | 0.56 | 0.492 | 0.496 | 0.508 |
| 2017-11-01 | 0.636 | 0.566 | 0.571 | 0.589 | 0.252 | 0.223 | 0.225 | 0.252 | 0.038 | 0.014 | 0.018 | 0.031 | 0.214 | 0.209 | 0.206 | 0.221 | 0.139 | 0.142 | 0.144 | 0.155 | 0.004 | 0.005 | 0.004 | 0.003 | 0.052 | 0.039 | 0.034 | 0.036 | 0.096 | 0.074 | 0.072 | 0.066 | 0.159 | 0.096 | 0.095 | 0.098 | 0.532 | 0.468 | 0.474 | 0.478 |
| 2017-12-01 | 0.627 | 0.562 | 0.568 | 0.586 | 0.246 | 0.21 | 0.215 | 0.246 | 0.035 | 0.014 | 0.017 | 0.03 | 0.21 | 0.196 | 0.198 | 0.215 | 0.137 | 0.13 | 0.139 | 0.149 | 0.004 | 0.004 | 0.004 | 0.003 | 0.048 | 0.039 | 0.035 | 0.03 | 0.098 | 0.077 | 0.074 | 0.064 | 0.159 | 0.096 | 0.095 | 0.101 | 0.532 | 0.469 | 0.474 | 0.48 |
| 2018-01-01 | 0.625 | 0.563 | 0.567 | 0.572 | 0.246 | 0.203 | 0.212 | 0.241 | 0.034 | 0.014 | 0.015 | 0.027 | 0.212 | 0.189 | 0.197 | 0.213 | 0.128 | 0.124 | 0.131 | 0.142 | 0.004 | 0.004 | 0.004 | 0.003 | 0.049 | 0.037 | 0.036 | 0.033 | 0.102 | 0.084 | 0.076 | 0.063 | 0.152 | 0.096 | 0.094 | 0.093 | 0.529 | 0.468 | 0.474 | 0.473 |
| 2018-02-01 | 0.65 | 0.58 | 0.59 | 0.613 | 0.253 | 0.219 | 0.223 | 0.265 | 0.039 | 0.017 | 0.019 | 0.035 | 0.215 | 0.202 | 0.204 | 0.23 | 0.133 | 0.132 | 0.142 | 0.152 | 0.004 | 0.005 | 0.004 | 0.003 | 0.059 | 0.046 | 0.039 | 0.038 | 0.102 | 0.081 | 0.076 | 0.065 | 0.165 | 0.097 | 0.099 | 0.101 | 0.558 | 0.487 | 0.496 | 0.51 |
| 2018-03-01 | 0.652 | 0.585 | 0.589 | 0.615 | 0.254 | 0.218 | 0.222 | 0.259 | 0.036 | 0.015 | 0.018 | 0.031 | 0.218 | 0.203 | 0.204 | 0.228 | 0.138 | 0.139 | 0.145 | 0.147 | 0.004 | 0.004 | 0.004 | 0.003 | 0.058 | 0.043 | 0.039 | 0.038 | 0.104 | 0.081 | 0.076 | 0.066 | 0.163 | 0.095 | 0.099 | 0.103 | 0.559 | 0.485 | 0.495 | 0.504 |
| 2018-04-01 | 0.661 | 0.58 | 0.594 | 0.621 | 0.261 | 0.221 | 0.232 | 0.261 | 0.039 | 0.016 | 0.018 | 0.032 | 0.223 | 0.204 | 0.214 | 0.229 | 0.139 | 0.141 | 0.145 | 0.155 | 0.004 | 0.004 | 0.004 | 0.002 | 0.055 | 0.043 | 0.038 | 0.039 | 0.101 | 0.079 | 0.073 | 0.065 | 0.164 | 0.098 | 0.097 | 0.101 | 0.559 | 0.487 | 0.495 | 0.506 |
| 2018-05-01 | 0.659 | 0.588 | 0.599 | 0.612 | 0.266 | 0.229 | 0.232 | 0.262 | 0.04 | 0.015 | 0.018 | 0.034 | 0.226 | 0.214 | 0.214 | 0.227 | 0.14 | 0.142 | 0.146 | 0.161 | 0.005 | 0.006 | 0.004 | 0.004 | 0.055 | 0.04 | 0.039 | 0.035 | 0.099 | 0.08 | 0.073 | 0.063 | 0.159 | 0.095 | 0.1 | 0.102 | 0.556 | 0.491 | 0.5 | 0.5 |
| 2018-06-01 | 0.662 | 0.589 | 0.595 | 0.617 | 0.266 | 0.222 | 0.23 | 0.267 | 0.039 | 0.016 | 0.017 | 0.035 | 0.227 | 0.207 | 0.213 | 0.232 | 0.143 | 0.142 | 0.147 | 0.149 | 0.005 | 0.005 | 0.004 | 0.003 | 0.057 | 0.037 | 0.035 | 0.036 | 0.104 | 0.076 | 0.073 | 0.062 | 0.168 | 0.099 | 0.1 | 0.108 | 0.561 | 0.485 | 0.498 | 0.504 |
| 2018-07-01 | 0.649 | 0.58 | 0.591 | 0.606 | 0.264 | 0.228 | 0.233 | 0.267 | 0.039 | 0.015 | 0.02 | 0.035 | 0.225 | 0.212 | 0.213 | 0.232 | 0.139 | 0.146 | 0.147 | 0.153 | 0.005 | 0.004 | 0.005 | 0.003 | 0.055 | 0.037 | 0.036 | 0.035 | 0.103 | 0.076 | 0.073 | 0.064 | 0.163 | 0.097 | 0.103 | 0.1 | 0.548 | 0.485 | 0.492 | 0.493 |
| 2018-08-01 | 0.66 | 0.58 | 0.598 | 0.622 | 0.263 | 0.223 | 0.23 | 0.262 | 0.037 | 0.016 | 0.017 | 0.033 | 0.226 | 0.207 | 0.213 | 0.229 | 0.135 | 0.142 | 0.15 | 0.151 | 0.006 | 0.004 | 0.004 | 0.004 | 0.053 | 0.039 | 0.037 | 0.034 | 0.104 | 0.075 | 0.074 | 0.063 | 0.171 | 0.099 | 0.104 | 0.102 | 0.558 | 0.483 | 0.5 | 0.501 |